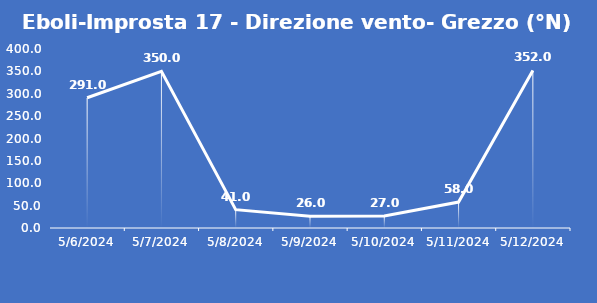
| Category | Eboli-Improsta 17 - Direzione vento- Grezzo (°N) |
|---|---|
| 5/6/24 | 291 |
| 5/7/24 | 350 |
| 5/8/24 | 41 |
| 5/9/24 | 26 |
| 5/10/24 | 27 |
| 5/11/24 | 58 |
| 5/12/24 | 352 |